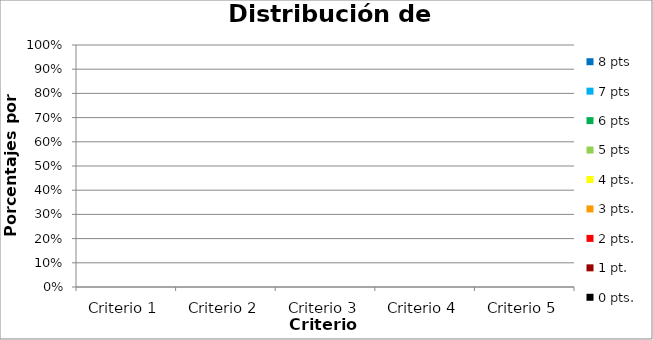
| Category | 8 pts | 7 pts | 6 pts | 5 pts | 4 pts. | 3 pts. | 2 pts. | 1 pt. | 0 pts. |
|---|---|---|---|---|---|---|---|---|---|
| Criterio 1 | 0 | 0 | 0 | 0 | 0 | 0 | 0 | 0 | 0 |
| Criterio 2 | 0 | 0 | 0 | 0 | 0 | 0 | 0 | 0 | 0 |
| Criterio 3 | 0 | 0 | 0 | 0 | 0 | 0 | 0 | 0 | 0 |
| Criterio 4 | 0 | 0 | 0 | 0 | 0 | 0 | 0 | 0 | 0 |
| Criterio 5 | 0 | 0 | 0 | 0 | 0 | 0 | 0 | 0 | 0 |